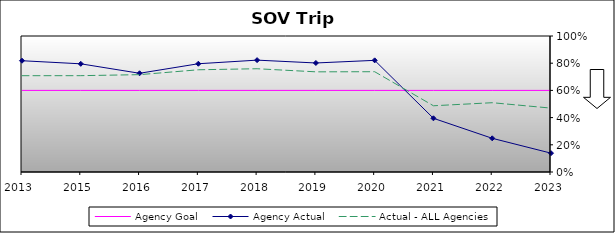
| Category | Agency Goal | Agency Actual | Actual - ALL Agencies |
|---|---|---|---|
| 2013.0 | 0.6 | 0.818 | 0.708 |
| 2015.0 | 0.6 | 0.795 | 0.708 |
| 2016.0 | 0.6 | 0.726 | 0.716 |
| 2017.0 | 0.6 | 0.796 | 0.752 |
| 2018.0 | 0.6 | 0.823 | 0.759 |
| 2019.0 | 0.6 | 0.802 | 0.736 |
| 2020.0 | 0.6 | 0.821 | 0.737 |
| 2021.0 | 0.6 | 0.395 | 0.487 |
| 2022.0 | 0.6 | 0.248 | 0.509 |
| 2023.0 | 0.6 | 0.138 | 0.47 |